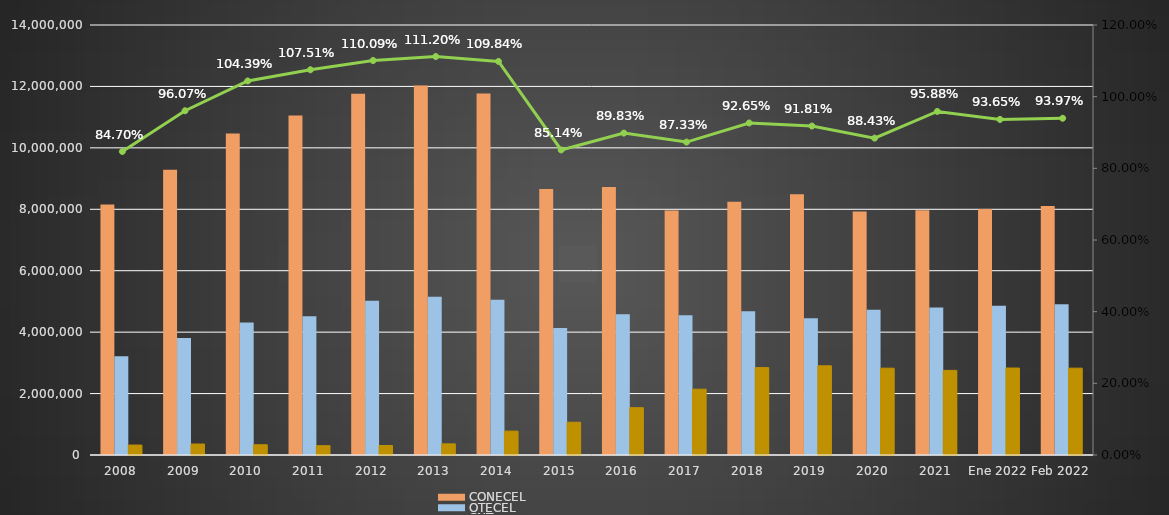
| Category | CONECEL | OTECEL | CNT |
|---|---|---|---|
| 2008 | 8156359 | 3211922 | 323967 |
| 2009 | 9291268 | 3806432 | 356900 |
| 2010 | 10470502 | 4314599 | 333730 |
| 2011 | 11057316 | 4513874 | 303368 |
| 2012 | 11757906 | 5019686 | 309271 |
| 2013 | 12030886 | 5148308 | 362560 |
| 2014 | 11772020 | 5055645 | 776892 |
| 2015 | 8658619 | 4134698 | 1065703 |
| 2016 | 8726823 | 4580092 | 1541219 |
| 2017 | 7960263 | 4549024 | 2142117 |
| 2018 | 8248050 | 4679646 | 2845142 |
| 2019 | 8493054 | 4456356 | 2903690 |
| 2020 | 7929253 | 4729725 | 2826388 |
| 2021 | 7965274 | 4800608 | 2755177 |
| Ene 2022 | 8012894 | 4856877 | 2831764 |
| Feb 2022 | 8103873 | 4909433 | 2827246 |